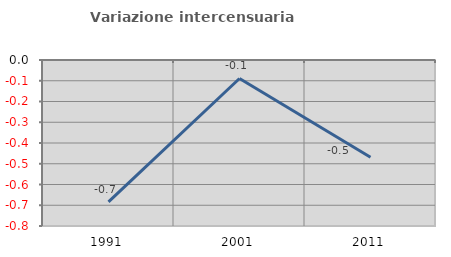
| Category | Variazione intercensuaria annua |
|---|---|
| 1991.0 | -0.684 |
| 2001.0 | -0.089 |
| 2011.0 | -0.469 |